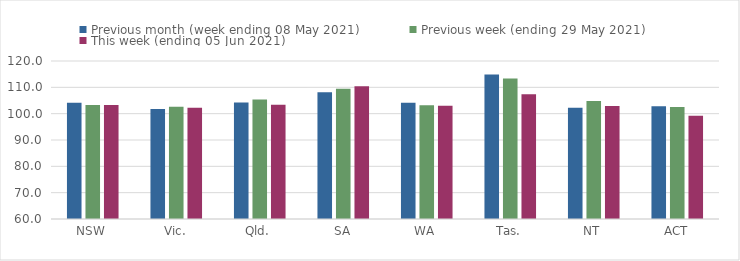
| Category | Previous month (week ending 08 May 2021) | Previous week (ending 29 May 2021) | This week (ending 05 Jun 2021) |
|---|---|---|---|
| NSW | 104.11 | 103.28 | 103.28 |
| Vic. | 101.8 | 102.67 | 102.2 |
| Qld. | 104.23 | 105.35 | 103.39 |
| SA | 108.18 | 109.48 | 110.4 |
| WA | 104.14 | 103.18 | 103.05 |
| Tas. | 114.86 | 113.33 | 107.39 |
| NT | 102.21 | 104.85 | 102.88 |
| ACT | 102.77 | 102.54 | 99.17 |